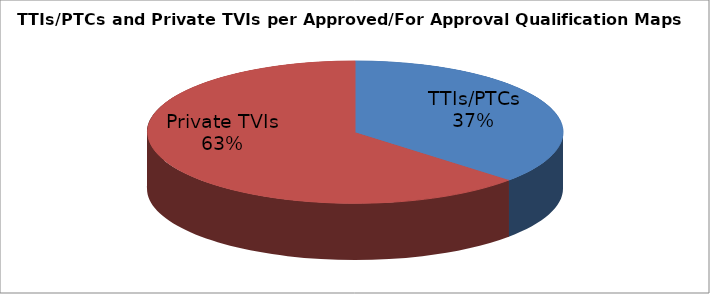
| Category | Series 0 |
|---|---|
| TTIs/PTCs | 132938732 |
| Private TVIs | 228730486.8 |